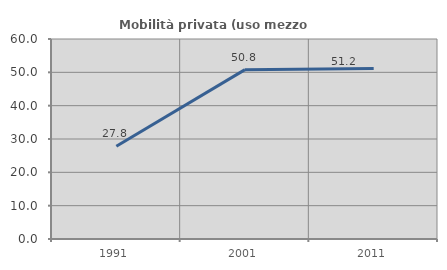
| Category | Mobilità privata (uso mezzo privato) |
|---|---|
| 1991.0 | 27.82 |
| 2001.0 | 50.806 |
| 2011.0 | 51.163 |